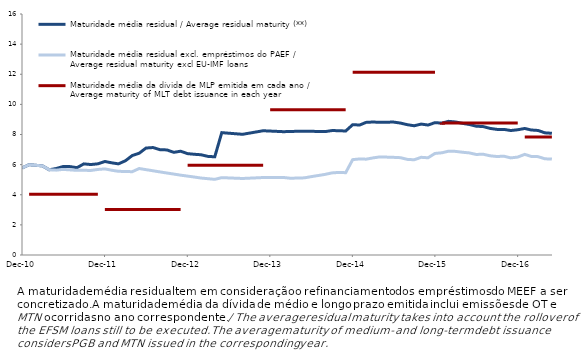
| Category | Maturidade média residual / Average residual maturity (**) | Maturidade média residual excl. empréstimos do PAEF / Average residual maturity excl EU-IMF loans | Maturidade média da dívida de MLP emitida em cada ano / Average maturity of MLT debt issuance in each year |
|---|---|---|---|
| 2010-12-31 | 5.779 | 5.779 | 7.35 |
| 2011-01-31 | 5.995 | 5.995 | 4.039 |
| 2011-02-28 | 5.958 | 5.958 | 4.039 |
| 2011-03-31 | 5.915 | 5.915 | 4.039 |
| 2011-04-30 | 5.658 | 5.658 | 4.039 |
| 2011-05-31 | 5.743 | 5.633 | 4.039 |
| 2011-06-30 | 5.873 | 5.683 | 4.039 |
| 2011-07-31 | 5.868 | 5.651 | 4.039 |
| 2011-08-31 | 5.799 | 5.619 | 4.039 |
| 2011-09-30 | 6.05 | 5.622 | 4.039 |
| 2011-10-31 | 6.006 | 5.614 | 4.039 |
| 2011-11-01 | 6.019 | 5.605 | 4.039 |
| 2011-12-01 | 6.054 | 5.68 | 4.039 |
| 2012-01-01 | 6.208 | 5.715 | 3.017 |
| 2012-02-01 | 6.118 | 5.626 | 3.017 |
| 2012-03-01 | 6.05 | 5.556 | 3.017 |
| 2012-04-01 | 6.257 | 5.545 | 3.017 |
| 2012-05-01 | 6.601 | 5.53 | 3.017 |
| 2012-06-01 | 6.759 | 5.743 | 3.017 |
| 2012-07-01 | 7.101 | 5.667 | 3.017 |
| 2012-08-01 | 7.134 | 5.591 | 3.017 |
| 2012-09-01 | 6.99 | 5.516 | 3.017 |
| 2012-10-01 | 6.976 | 5.444 | 3.017 |
| 2012-11-01 | 6.816 | 5.372 | 3.017 |
| 2012-12-01 | 6.889 | 5.301 | 3.017 |
| 2013-01-01 | 6.729 | 5.237 | 5.956 |
| 2013-02-01 | 6.685 | 5.173 | 5.956 |
| 2013-03-01 | 6.656 | 5.11 | 5.956 |
| 2013-04-01 | 6.546 | 5.066 | 5.956 |
| 2013-05-01 | 6.52 | 5.023 | 5.956 |
| 2013-06-01 | 8.123 | 5.136 | 5.956 |
| 2013-07-01 | 8.087 | 5.118 | 5.956 |
| 2013-08-01 | 8.05 | 5.099 | 5.956 |
| 2013-09-01 | 8.013 | 5.08 | 5.956 |
| 2013-10-01 | 8.092 | 5.101 | 5.956 |
| 2013-11-01 | 8.17 | 5.122 | 5.956 |
| 2013-12-01 | 8.249 | 5.143 | 5.956 |
| 2014-01-01 | 8.228 | 5.145 | 9.636 |
| 2014-02-01 | 8.207 | 5.146 | 9.636 |
| 2014-03-01 | 8.186 | 5.148 | 9.636 |
| 2014-04-01 | 8.202 | 5.096 | 9.636 |
| 2014-05-01 | 8.212 | 5.109 | 9.636 |
| 2014-06-01 | 8.222 | 5.122 | 9.636 |
| 2014-07-01 | 8.212 | 5.199 | 9.636 |
| 2014-08-01 | 8.202 | 5.276 | 9.636 |
| 2014-09-01 | 8.192 | 5.353 | 9.636 |
| 2014-10-01 | 8.26 | 5.449 | 9.636 |
| 2014-11-01 | 8.254 | 5.483 | 9.636 |
| 2014-12-01 | 8.23 | 5.465 | 9.636 |
| 2015-01-01 | 8.652 | 6.332 | 12.125 |
| 2015-02-01 | 8.629 | 6.378 | 12.125 |
| 2015-03-01 | 8.804 | 6.362 | 12.125 |
| 2015-04-01 | 8.83 | 6.446 | 12.125 |
| 2015-05-01 | 8.806 | 6.513 | 12.125 |
| 2015-06-30 | 8.826 | 6.484 | 12.125 |
| 2015-07-31 | 8.759 | 6.462 | 12.125 |
| 2015-08-31 | 8.65 | 6.348 | 12.125 |
| 2015-09-30 | 8.581 | 6.322 | 12.125 |
| 2015-10-31 | 8.692 | 6.487 | 12.125 |
| 2015-11-30 | 8.628 | 6.453 | 12.125 |
| 2015-12-31 | 8.786 | 6.742 | 12.125 |
| 2016-01-31 | 8.756 | 6.787 | 8.755 |
| 2016-02-29 | 8.874 | 6.893 | 8.755 |
| 2016-03-31 | 8.83 | 6.879 | 8.755 |
| 2016-04-30 | 8.741 | 6.823 | 8.755 |
| 2016-05-31 | 8.664 | 6.779 | 8.755 |
| 2016-06-30 | 8.55 | 6.675 | 8.755 |
| 2016-07-31 | 8.527 | 6.691 | 8.755 |
| 2016-08-31 | 8.405 | 6.585 | 8.755 |
| 2016-09-30 | 8.339 | 6.539 | 8.755 |
| 2016-10-31 | 8.339 | 6.56 | 8.755 |
| 2016-11-30 | 8.264 | 6.447 | 8.755 |
| 2016-12-31 | 8.314 | 6.501 | 8.755 |
| 2017-01-31 | 8.4 | 6.682 | 7.834 |
| 2017-02-28 | 8.3 | 6.547 | 7.834 |
| 2017-03-31 | 8.268 | 6.53 | 7.834 |
| 2017-04-30 | 8.111 | 6.385 | 7.834 |
| 2017-05-31 | 8.08 | 6.371 | 7.834 |